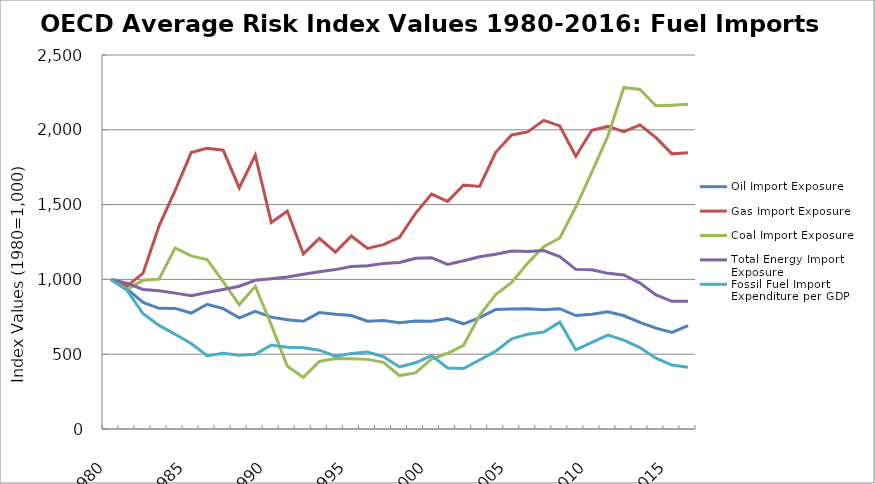
| Category | Oil Import Exposure | Gas Import Exposure | Coal Import Exposure | Total Energy Import Exposure | Fossil Fuel Import Expenditure per GDP |
|---|---|---|---|---|---|
| 1980.0 | 1000 | 1000 | 1000 | 1000 | 1000 |
| 1981.0 | 935.44 | 955.243 | 931.952 | 975.117 | 926.609 |
| 1982.0 | 846.511 | 1041.986 | 994.31 | 932.966 | 770.05 |
| 1983.0 | 806.676 | 1358.346 | 1001.524 | 923.471 | 692.407 |
| 1984.0 | 806.159 | 1594.501 | 1210.389 | 908.329 | 633.387 |
| 1985.0 | 775.182 | 1847.388 | 1156.884 | 891.133 | 571.706 |
| 1986.0 | 833.833 | 1875.81 | 1132.339 | 912.676 | 489.802 |
| 1987.0 | 804.361 | 1863.506 | 984.482 | 932.606 | 506.541 |
| 1988.0 | 743.244 | 1611.883 | 830.577 | 954.172 | 492.368 |
| 1989.0 | 786.688 | 1830.376 | 954.112 | 993.813 | 500.059 |
| 1990.0 | 747.793 | 1380.089 | 695.987 | 1004.747 | 560.902 |
| 1991.0 | 729.598 | 1456.877 | 419.642 | 1015.948 | 546.635 |
| 1992.0 | 720.167 | 1170.376 | 345.101 | 1034.558 | 543.666 |
| 1993.0 | 777.874 | 1274.091 | 451.72 | 1051.422 | 526.702 |
| 1994.0 | 766.697 | 1182.485 | 470.761 | 1065.506 | 487.18 |
| 1995.0 | 758.415 | 1290.001 | 469.486 | 1086.437 | 504.486 |
| 1996.0 | 720.992 | 1207.533 | 465.415 | 1091.794 | 515.364 |
| 1997.0 | 724.572 | 1232.177 | 445.234 | 1105.754 | 483.092 |
| 1998.0 | 710.171 | 1281.125 | 357.329 | 1112.945 | 414.803 |
| 1999.0 | 721.301 | 1441.337 | 375.02 | 1141.149 | 442.526 |
| 2000.0 | 719.949 | 1570.694 | 467.991 | 1145.355 | 490.775 |
| 2001.0 | 738.02 | 1521.458 | 506.309 | 1100.513 | 408.02 |
| 2002.0 | 703.215 | 1630.809 | 559.756 | 1124.504 | 403.978 |
| 2003.0 | 744.341 | 1621.61 | 759.843 | 1151.149 | 461.393 |
| 2004.0 | 799.516 | 1849.996 | 899.086 | 1168.389 | 520.207 |
| 2005.0 | 802.237 | 1965.274 | 979.819 | 1190.286 | 603.322 |
| 2006.0 | 804.333 | 1986.139 | 1108.874 | 1186.684 | 634.016 |
| 2007.0 | 796.448 | 2063.356 | 1218.718 | 1192.72 | 648.031 |
| 2008.0 | 804.052 | 2025.886 | 1276.779 | 1153.268 | 714.269 |
| 2009.0 | 758.256 | 1822.812 | 1483.748 | 1066.997 | 529.663 |
| 2010.0 | 766.43 | 1997.129 | 1716.559 | 1063.925 | 578.879 |
| 2011.0 | 783.939 | 2022.588 | 1957.093 | 1040.413 | 627.127 |
| 2012.0 | 757.005 | 1987.395 | 2283.179 | 1029.749 | 594.437 |
| 2013.0 | 712.881 | 2032.762 | 2270.112 | 974.907 | 544.256 |
| 2014.0 | 674.626 | 1947.204 | 2161.093 | 896.141 | 473.617 |
| 2015.0 | 645.881 | 1839.127 | 2164.892 | 853.262 | 427.136 |
| 2016.0 | 690.937 | 1846.583 | 2170.448 | 853.155 | 413.137 |